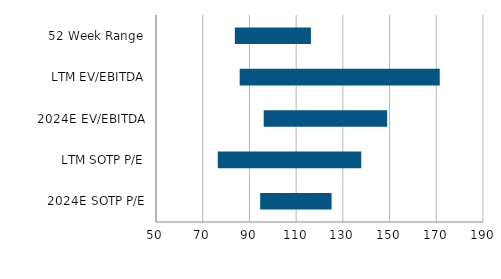
| Category | Series 0 | Series 1 | Series 2 |
|---|---|---|---|
| 52 Week Range |  | 83.76 | 32.57 |
| LTM EV/EBITDA |  | 85.822 | 85.66 |
| 2024E EV/EBITDA |  | 96.11 | 52.853 |
| LTM SOTP P/E |  | 76.437 | 61.434 |
| 2024E SOTP P/E |  | 94.599 | 30.579 |